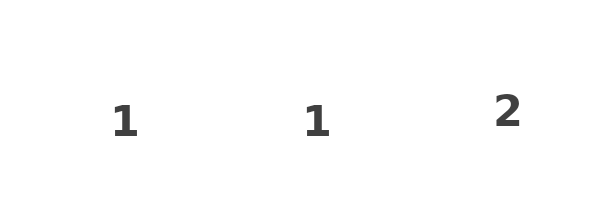
| Category | 1 |
|---|---|
| 0 | 1 |
| 1 | 1 |
| 2 | 2 |